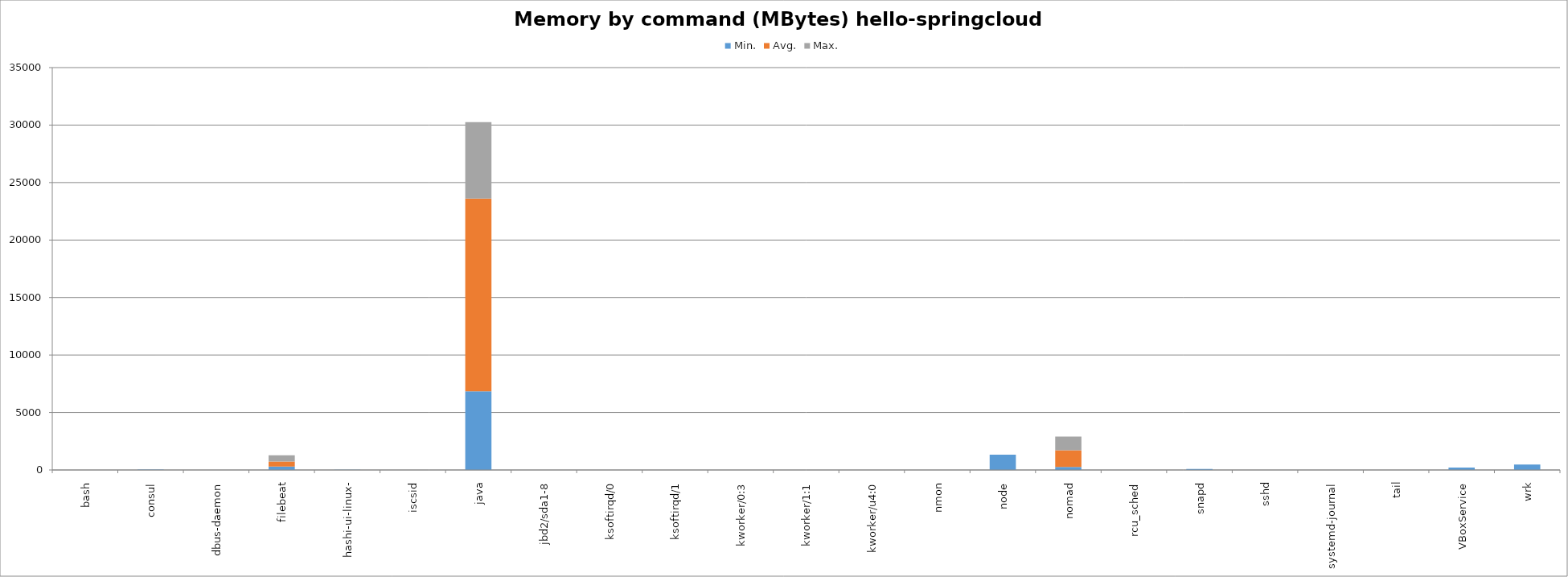
| Category | Min. | Avg. | Max. |
|---|---|---|---|
| bash | 3064 | 26.667 | 13.333 |
| consul | 41100 | 0 | 0 |
| dbus-daemon | 792 | 0 | 0 |
| filebeat | 297524 | 428894.036 | 554649.964 |
| hashi-ui-linux- | 16544 | 0 | 0 |
| iscsid | 884 | 250 | 250 |
| java | 6835316 | 16780287.038 | 6641132.962 |
| jbd2/sda1-8 | 0 | 0 | 0 |
| ksoftirqd/0 | 0 | 0 | 0 |
| ksoftirqd/1 | 0 | 0 | 0 |
| kworker/0:3 | 0 | 0 | 0 |
| kworker/1:1 | 0 | 0 | 0 |
| kworker/u4:0 | 0 | 0 | 0 |
| nmon | 4160 | 0 | 0 |
| node | 1332544 | 955.733 | 1092.267 |
| nomad | 261996 | 1458835.899 | 1180316.101 |
| rcu_sched | 0 | 0 | 0 |
| snapd | 82116 | 0 | 0 |
| sshd | 1936 | 0 | 0 |
| systemd-journal | 668 | 0 | 0 |
| tail | 376 | 0 | 0 |
| VBoxService | 218172 | 0 | 0 |
| wrk | 466480 | 0 | 0 |